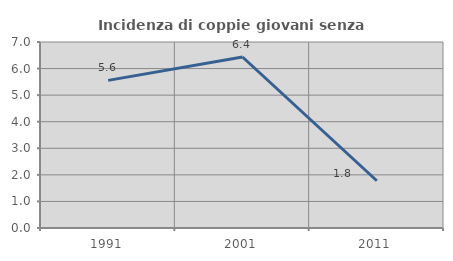
| Category | Incidenza di coppie giovani senza figli |
|---|---|
| 1991.0 | 5.556 |
| 2001.0 | 6.436 |
| 2011.0 | 1.778 |